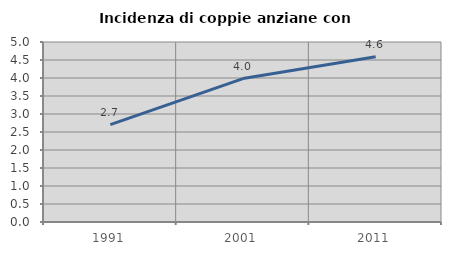
| Category | Incidenza di coppie anziane con figli |
|---|---|
| 1991.0 | 2.705 |
| 2001.0 | 3.984 |
| 2011.0 | 4.59 |